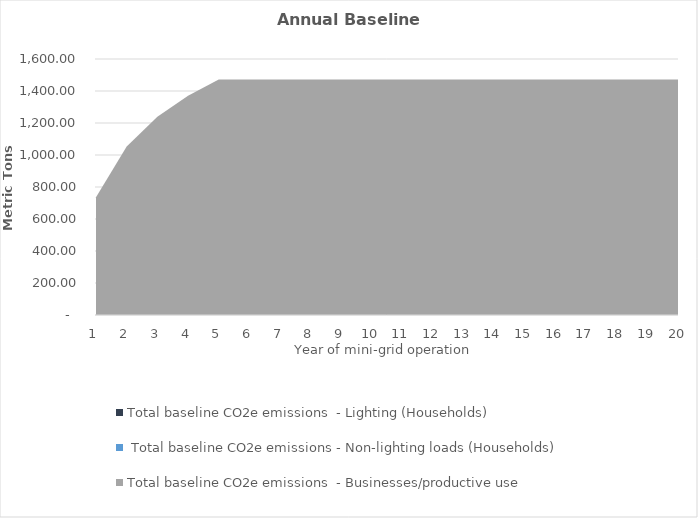
| Category | Total baseline CO2e emissions  - Lighting (Households) |  Total baseline CO2e emissions - Non-lighting loads (Households) | Total baseline CO2e emissions  - Businesses/productive use |
|---|---|---|---|
| 1.0 | 0 | 0 | 735.966 |
| 2.0 | 0 | 0 | 1052.929 |
| 3.0 | 0 | 0 | 1238.341 |
| 4.0 | 0 | 0 | 1369.893 |
| 5.0 | 0 | 0 | 1471.932 |
| 6.0 | 0 | 0 | 1471.932 |
| 7.0 | 0 | 0 | 1471.932 |
| 8.0 | 0 | 0 | 1471.932 |
| 9.0 | 0 | 0 | 1471.932 |
| 10.0 | 0 | 0 | 1471.932 |
| 11.0 | 0 | 0 | 1471.932 |
| 12.0 | 0 | 0 | 1471.932 |
| 13.0 | 0 | 0 | 1471.932 |
| 14.0 | 0 | 0 | 1471.932 |
| 15.0 | 0 | 0 | 1471.932 |
| 16.0 | 0 | 0 | 1471.932 |
| 17.0 | 0 | 0 | 1471.932 |
| 18.0 | 0 | 0 | 1471.932 |
| 19.0 | 0 | 0 | 1471.932 |
| 20.0 | 0 | 0 | 1471.932 |